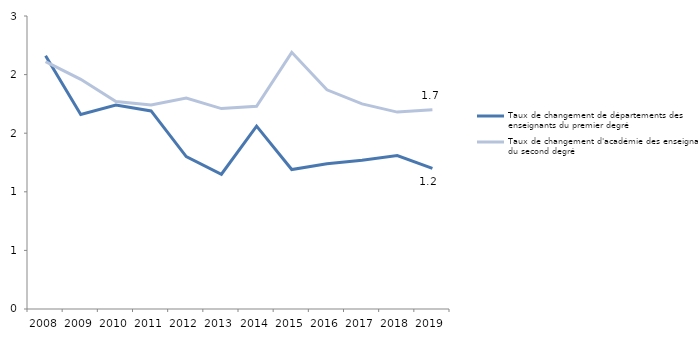
| Category | Taux de changement de départements des enseignants du premier degré | Taux de changement d'académie des enseignants du second degré |
|---|---|---|
| 2008 | 2.16 | 2.11 |
| 2009 | 1.66 | 1.96 |
| 2010 | 1.74 | 1.77 |
| 2011 | 1.69 | 1.74 |
| 2012 | 1.3 | 1.8 |
| 2013 | 1.15 | 1.71 |
| 2014 | 1.56 | 1.73 |
| 2015 | 1.19 | 2.19 |
| 2016 | 1.24 | 1.87 |
| 2017 | 1.27 | 1.75 |
| 2018 | 1.31 | 1.68 |
| 2019 | 1.2 | 1.7 |